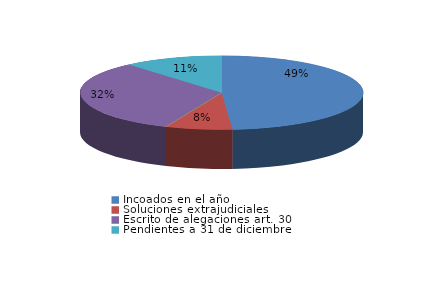
| Category | Series 0 |
|---|---|
| Incoados en el año | 160 |
| Soluciones extrajudiciales | 25 |
| Sobreseimiento del art. 27.4 | 0 |
| Escrito de alegaciones art. 30 | 106 |
| Pendientes a 31 de diciembre | 37 |